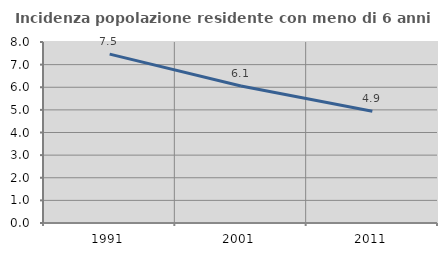
| Category | Incidenza popolazione residente con meno di 6 anni |
|---|---|
| 1991.0 | 7.465 |
| 2001.0 | 6.055 |
| 2011.0 | 4.937 |